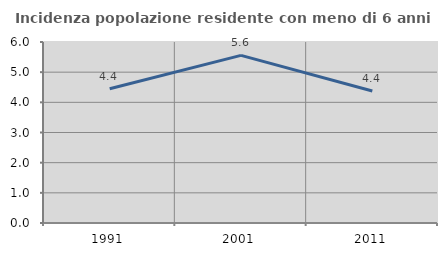
| Category | Incidenza popolazione residente con meno di 6 anni |
|---|---|
| 1991.0 | 4.449 |
| 2001.0 | 5.556 |
| 2011.0 | 4.377 |